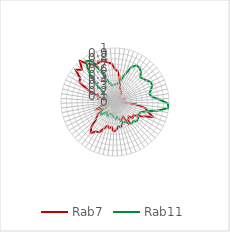
| Category | Rab7 | Rab11 |
|---|---|---|
| 0.0 | 0.608 | 0.32 |
| 0.10913 | 0.57 | 0.334 |
| 0.21825 | 0.473 | 0.364 |
| 0.32738 | 0.34 | 0.426 |
| 0.43651 | 0.27 | 0.553 |
| 0.54563 | 0.238 | 0.722 |
| 0.65476 | 0.225 | 0.786 |
| 0.76389 | 0.202 | 0.778 |
| 0.87302 | 0.18 | 0.741 |
| 0.98214 | 0.084 | 0.654 |
| 1.09127 | 0.13 | 0.675 |
| 1.2004 | 0.033 | 0.711 |
| 1.30952 | 0.056 | 0.758 |
| 1.41865 | 0.071 | 0.756 |
| 1.52778 | 0.2 | 0.704 |
| 1.6369 | 0.188 | 0.654 |
| 1.74603 | 0.006 | 0.678 |
| 1.85516 | 0 | 0.803 |
| 1.96429 | 0.141 | 0.973 |
| 2.07341 | 0.385 | 1 |
| 2.18254 | 0.572 | 0.807 |
| 2.29167 | 0.63 | 0.604 |
| 2.40079 | 0.757 | 0.517 |
| 2.50992 | 0.598 | 0.491 |
| 2.61905 | 0.472 | 0.507 |
| 2.72817 | 0.419 | 0.53 |
| 2.8373 | 0.442 | 0.538 |
| 2.94643 | 0.369 | 0.489 |
| 3.05556 | 0.401 | 0.506 |
| 3.16468 | 0.492 | 0.449 |
| 3.27381 | 0.305 | 0.425 |
| 3.38294 | 0.328 | 0.408 |
| 3.49206 | 0.445 | 0.381 |
| 3.60119 | 0.475 | 0.316 |
| 3.71032 | 0.452 | 0.276 |
| 3.81944 | 0.521 | 0.317 |
| 3.92857 | 0.549 | 0.282 |
| 4.0377 | 0.467 | 0.269 |
| 4.14683 | 0.497 | 0.224 |
| 4.25595 | 0.458 | 0.232 |
| 4.36508 | 0.539 | 0.24 |
| 4.47421 | 0.637 | 0.294 |
| 4.58333 | 0.648 | 0.278 |
| 4.69246 | 0.73 | 0.227 |
| 4.80159 | 0.645 | 0.281 |
| 4.91071 | 0.466 | 0.348 |
| 5.01984 | 0.407 | 0.322 |
| 5.12897 | 0.304 | 0.234 |
| 5.2381 | 0.276 | 0.114 |
| 5.34722 | 0.363 | 0.035 |
| 5.45635 | 0.279 | 0.029 |
| 5.56548 | 0.173 | 0.003 |
| 5.6746 | 0.004 | 0 |
| 5.78373 | 0.133 | 0.009 |
| 5.89286 | 0.049 | 0.033 |
| 6.00198 | 0.211 | 0.049 |
| 6.11111 | 0.23 | 0.043 |
| 6.22024 | 0.328 | 0.04 |
| 6.32937 | 0.552 | 0.064 |
| 6.43849 | 0.756 | 0.078 |
| 6.54762 | 0.778 | 0.159 |
| 6.65675 | 0.944 | 0.29 |
| 6.76587 | 0.856 | 0.514 |
| 6.875 | 1 | 0.756 |
| 6.98413 | 0.867 | 0.931 |
| 7.09325 | 0.806 | 0.88 |
| 7.20238 | 0.779 | 0.65 |
| 7.31151 | 0.795 | 0.448 |
| 7.42063 | 0.785 | 0.356 |
| 7.52976 | 0.743 | 0.313 |
| 7.63889 | 0.713 | 0.321 |